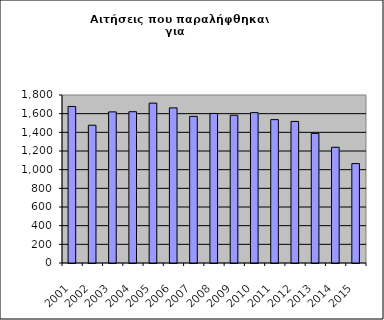
| Category | Series 1 |
|---|---|
| 2001.0 | 1677 |
| 2002.0 | 1476 |
| 2003.0 | 1619 |
| 2004.0 | 1621 |
| 2005.0 | 1713 |
| 2006.0 | 1662 |
| 2007.0 | 1571 |
| 2008.0 | 1602 |
| 2009.0 | 1583 |
| 2010.0 | 1611 |
| 2011.0 | 1536 |
| 2012.0 | 1517 |
| 2013.0 | 1389 |
| 2014.0 | 1240 |
| 2015.0 | 1065 |